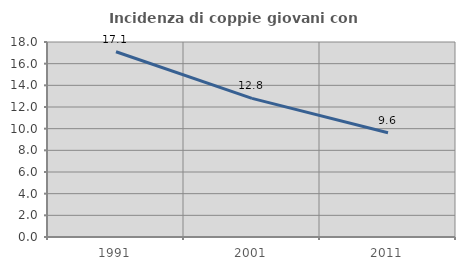
| Category | Incidenza di coppie giovani con figli |
|---|---|
| 1991.0 | 17.098 |
| 2001.0 | 12.8 |
| 2011.0 | 9.62 |